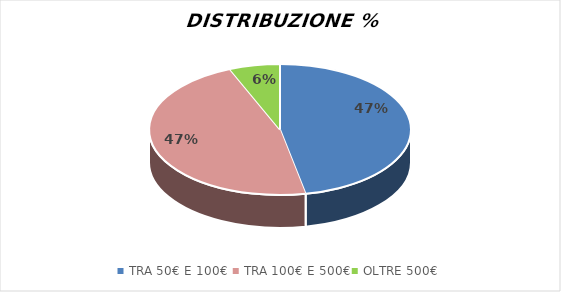
| Category | % |
|---|---|
| TRA 50€ E 100€  | 0.469 |
| TRA 100€ E 500€ | 0.469 |
| OLTRE 500€ | 0.062 |